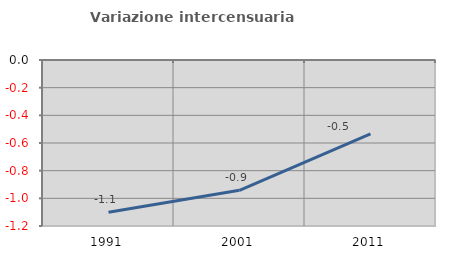
| Category | Variazione intercensuaria annua |
|---|---|
| 1991.0 | -1.101 |
| 2001.0 | -0.942 |
| 2011.0 | -0.534 |